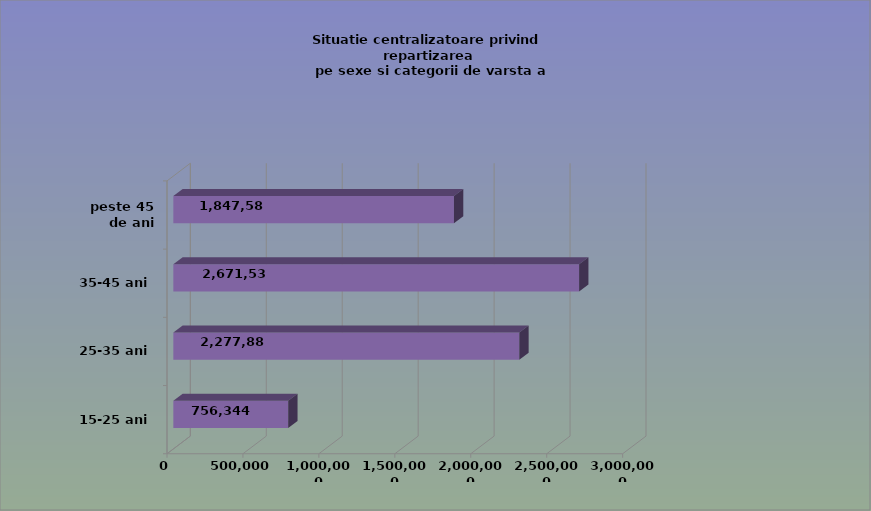
| Category | 15-25 ani 25-35 ani 35-45 ani peste 45 de ani |
|---|---|
| 15-25 ani | 756344 |
| 25-35 ani | 2277880 |
| 35-45 ani | 2671536 |
| peste 45 de ani | 1847586 |